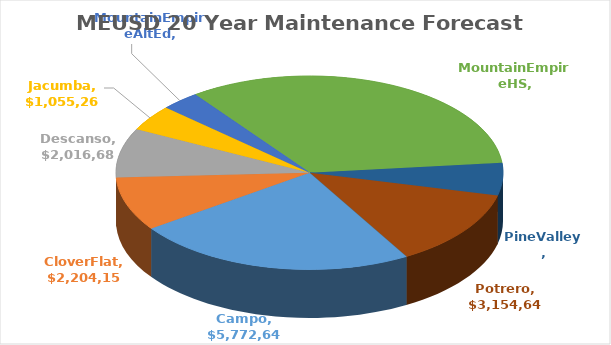
| Category | Series 0 |
|---|---|
| Campo | 5772640.565 |
| CloverFlat | 2204150.205 |
| Descanso | 2016685.596 |
| Jacumba | 1055265.594 |
| MountainEmpireAltEd | 783735.425 |
| MountainEmpireHS | 8200213.599 |
| PineValley | 1328629.39 |
| Potrero | 3154640.34 |
| MOT | 0 |